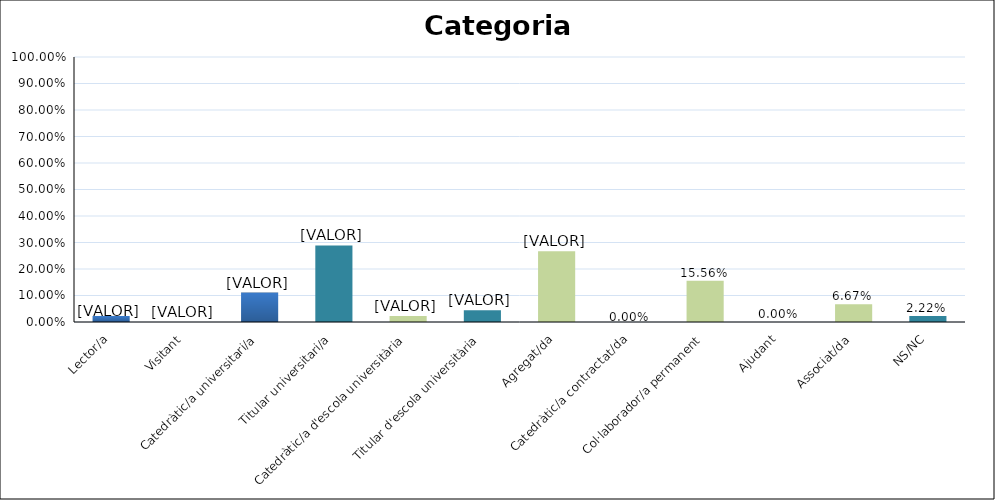
| Category | Series 0 |
|---|---|
| Lector/a | 0.022 |
| Visitant | 0 |
| Catedràtic/a universitari/a | 0.111 |
| Titular universitari/a | 0.289 |
| Catedràtic/a d'escola universitària | 0.022 |
| Titular d'escola universitària | 0.044 |
| Agregat/da | 0.267 |
| Catedràtic/a contractat/da | 0 |
| Col·laborador/a permanent | 0.156 |
| Ajudant | 0 |
| Associat/da | 0.067 |
| NS/NC | 0.022 |